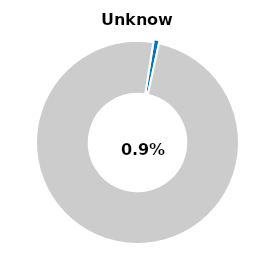
| Category | Series 0 |
|---|---|
| Unknown | 0.009 |
| Other | 0.991 |